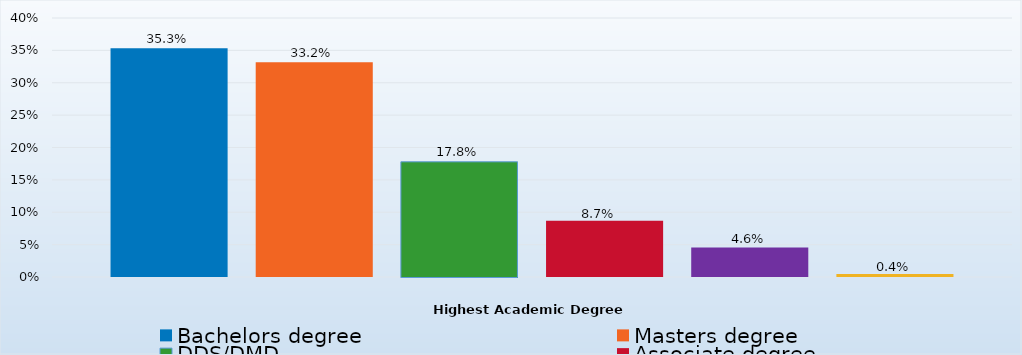
| Category | Bachelors degree | Masters degree | DDS/DMD | Associate degree | Doctorate degree | Certificate/Diploma/Other |
|---|---|---|---|---|---|---|
| Percent | 0.353 | 0.332 | 0.178 | 0.087 | 0.046 | 0.004 |